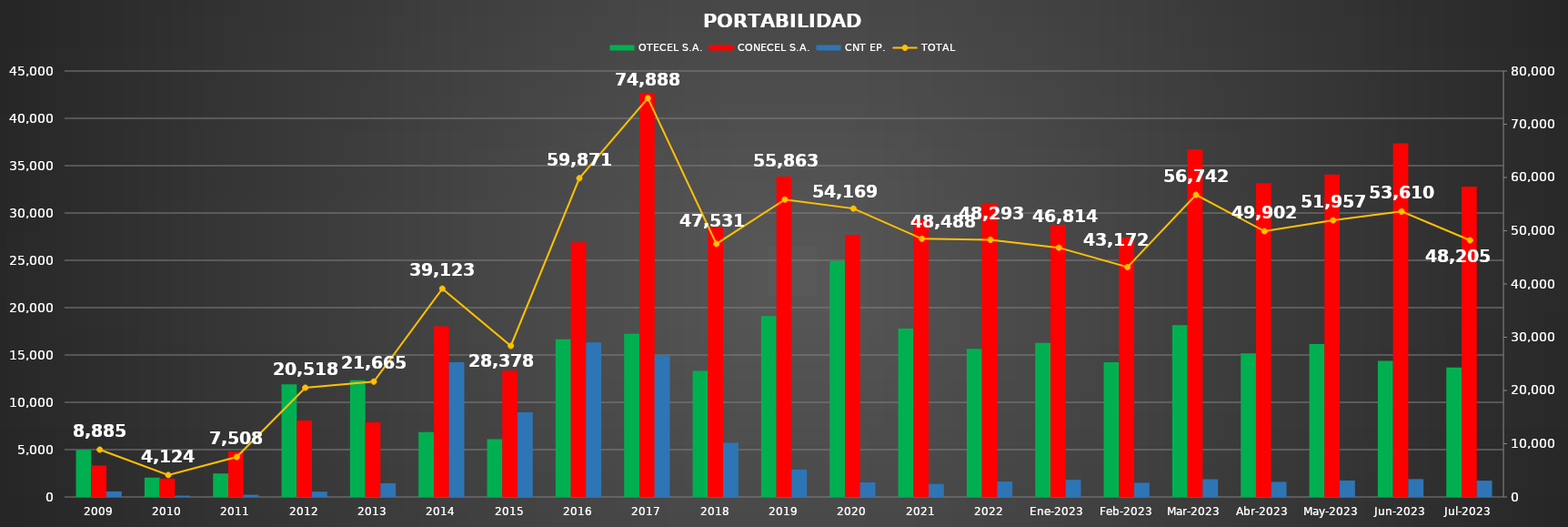
| Category | OTECEL S.A. | CONECEL S.A. | CNT EP. |
|---|---|---|---|
| 2009 | 4973 | 3324 | 588 |
| 2010 | 2045 | 1939 | 140 |
| 2011 | 2484 | 4796 | 228 |
| 2012 | 11894 | 8067 | 557 |
| 2013 | 12323 | 7893 | 1449 |
| 2014 | 6853 | 18039 | 14231 |
| 2015 | 6105 | 13334 | 8939 |
| 2016 | 16653 | 26907 | 16311 |
| 2017 | 17228 | 42694 | 14966 |
| 2018 | 13309 | 28504 | 5718 |
| 2019 | 19116 | 33857 | 2890 |
| 2020 | 24933 | 27700 | 1536 |
| 2021 | 17795 | 29321 | 1372 |
| 2022 | 15655 | 31012 | 1626 |
| Ene-2023 | 16278 | 28730 | 1806 |
| Feb-2023 | 14237 | 27438 | 1497 |
| Mar-2023 | 18159 | 36713 | 1870 |
| Abr-2023 | 15167 | 33140 | 1595 |
| May-2023 | 16147 | 34074 | 1736 |
| Jun-2023 | 14369 | 37353 | 1888 |
| Jul-2023 | 13685 | 32795 | 1725 |